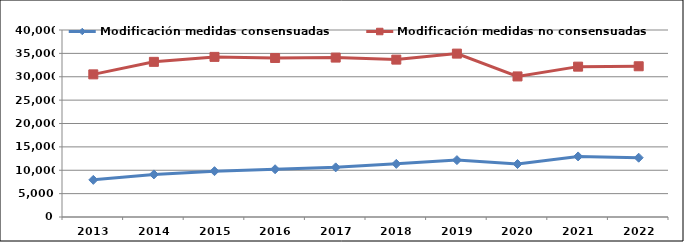
| Category | Modificación medidas consensuadas | Modificación medidas no consensuadas |
|---|---|---|
| 2013.0 | 7943 | 30511 |
| 2014.0 | 9110 | 33188 |
| 2015.0 | 9805 | 34248 |
| 2016.0 | 10214 | 34017 |
| 2017.0 | 10617 | 34099 |
| 2018.0 | 11366 | 33666 |
| 2019.0 | 12166 | 34949 |
| 2020.0 | 11329 | 30070 |
| 2021.0 | 12955 | 32162 |
| 2022.0 | 12681 | 32241 |